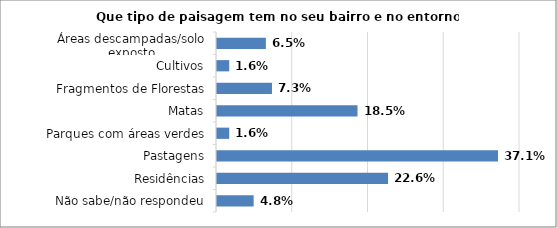
| Category | Series 0 |
|---|---|
| Não sabe/não respondeu | 0.048 |
| Residências | 0.226 |
| Pastagens | 0.371 |
| Parques com áreas verdes | 0.016 |
| Matas | 0.185 |
| Fragmentos de Florestas | 0.073 |
| Cultivos | 0.016 |
| Áreas descampadas/solo exposto | 0.065 |